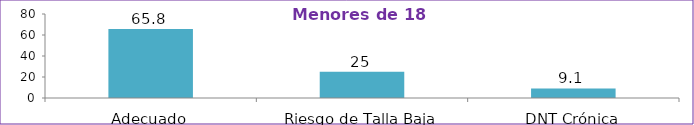
| Category | Series 0 |
|---|---|
| Adecuado | 65.8 |
| Riesgo de Talla Baja | 25 |
| DNT Crónica | 9.1 |